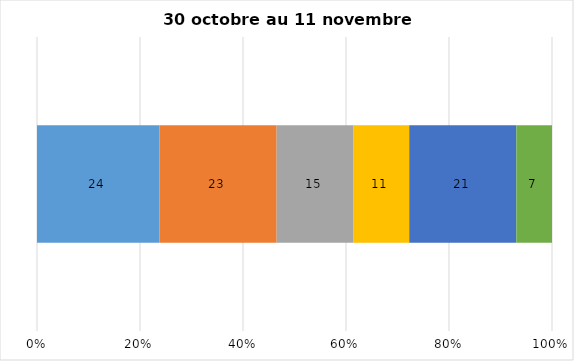
| Category | Plusieurs fois par jour | Une fois par jour | Quelques fois par semaine   | Une fois par semaine ou moins   |  Jamais   |  Je n’utilise pas les médias sociaux |
|---|---|---|---|---|---|---|
| 0 | 24 | 23 | 15 | 11 | 21 | 7 |